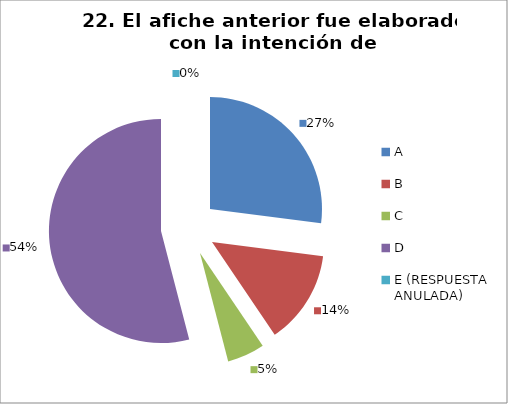
| Category | CANTIDAD DE RESPUESTAS PREGUNTA (22) | PORCENTAJE |
|---|---|---|
| A | 10 | 0.27 |
| B | 5 | 0.135 |
| C | 2 | 0.054 |
| D | 20 | 0.541 |
| E (RESPUESTA ANULADA) | 0 | 0 |